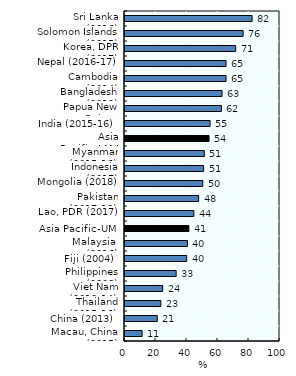
| Category | Series 1 |
|---|---|
| Sri Lanka (2016) | 82 |
| Solomon Islands (2015) | 76.2 |
| Korea, DPR (2017) | 71.4 |
| Nepal (2016-17) | 65.2 |
| Cambodia (2014) | 65.2 |
| Bangladesh (2019) | 62.6 |
| Papua New Guinea (2016-18) | 62.2 |
| India (2015-16) | 54.9 |
| Asia Pacific-LM/L | 54.214 |
| Myanmar (2015-16) | 51.2 |
| Indonesia (2017) | 50.7 |
| Mongolia (2018) | 50.2 |
| Pakistan (2017-18) | 47.5 |
| Lao, PDR (2017) | 44.4 |
| Asia Pacific-UM | 41.2 |
| Malaysia  (2016) | 40.3 |
| Fiji (2004) | 39.8 |
| Philippines (2008) | 33 |
| Viet Nam (2013-14) | 24.3 |
| Thailand (2015-16) | 23.1 |
| China (2013) | 20.8 |
| Macau, China (2015) | 11.053 |